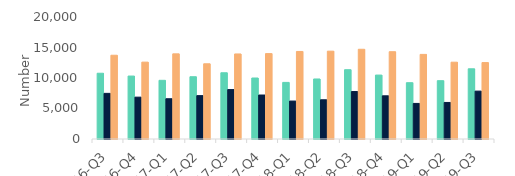
| Category | First-time
buyers | Homemovers | Homowner remortgaging |
|---|---|---|---|
| 16-Q3 | 10780 | 7480 | 13730 |
| 16-Q4 | 10320 | 6860 | 12600 |
| 17-Q1 | 9620 | 6600 | 13960 |
| 17-Q2 | 10210 | 7110 | 12330 |
| 17-Q3 | 10860 | 8100 | 13940 |
| 17-Q4 | 10000 | 7210 | 14000 |
| 18-Q1 | 9280 | 6220 | 14350 |
| 18-Q2 | 9840 | 6430 | 14400 |
| 18-Q3 | 11360 | 7780 | 14710 |
| 18-Q4 | 10480 | 7080 | 14310 |
| 19-Q1 | 9230 | 5830 | 13870 |
| 19-Q2 | 9560 | 5990 | 12590 |
| 19-Q3 | 11510 | 7850 | 12530 |